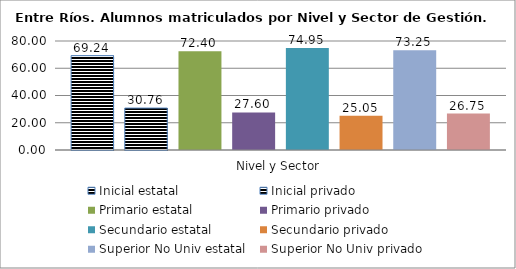
| Category | Inicial estatal | Inicial privado | Primario estatal | Primario privado | Secundario estatal | Secundario privado | Superior No Univ estatal | Superior No Univ privado |
|---|---|---|---|---|---|---|---|---|
| 0 | 69.237 | 30.763 | 72.398 | 27.602 | 74.945 | 25.055 | 73.25 | 26.75 |